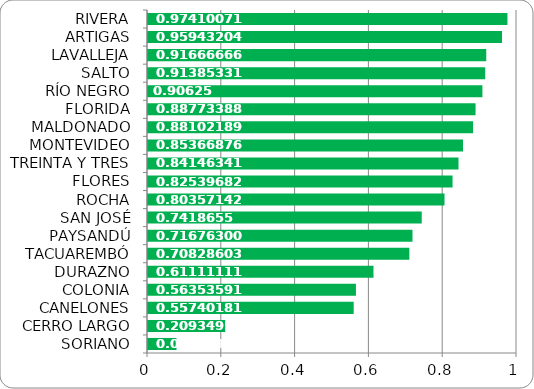
| Category | Series 0 |
|---|---|
| SORIANO | 0.077 |
| CERRO LARGO | 0.209 |
| CANELONES | 0.557 |
| COLONIA | 0.564 |
| DURAZNO | 0.611 |
| TACUAREMBÓ | 0.708 |
| PAYSANDÚ | 0.717 |
| SAN JOSÉ | 0.742 |
| ROCHA | 0.804 |
| FLORES | 0.825 |
| TREINTA Y TRES | 0.841 |
| MONTEVIDEO | 0.854 |
| MALDONADO | 0.881 |
| FLORIDA | 0.888 |
| RÍO NEGRO | 0.906 |
| SALTO | 0.914 |
| LAVALLEJA | 0.917 |
| ARTIGAS | 0.959 |
| RIVERA | 0.974 |